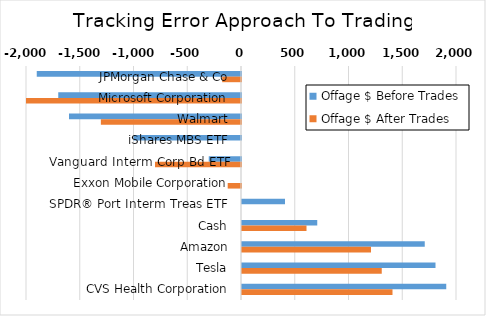
| Category | Offage $ Before Trades | Offage $ After Trades |
|---|---|---|
| JPMorgan Chase & Co | -1900 | -175.04 |
| Microsoft Corporation | -1700 | -2097.61 |
| Walmart | -1600 | -1303.61 |
| iShares MBS ETF | -1000 | 0 |
| Vanguard Interm Corp Bd ETF | -300 | -800 |
| Exxon Mobile Corporation | 0 | -123.74 |
| SPDR® Port Interm Treas ETF | 400 | 0 |
| Cash | 700 | 600 |
| Amazon | 1700 | 1200 |
| Tesla | 1800 | 1300 |
| CVS Health Corporation | 1900 | 1400 |